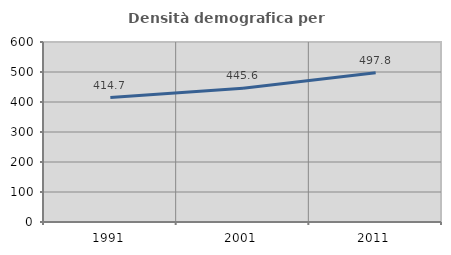
| Category | Densità demografica |
|---|---|
| 1991.0 | 414.724 |
| 2001.0 | 445.622 |
| 2011.0 | 497.829 |